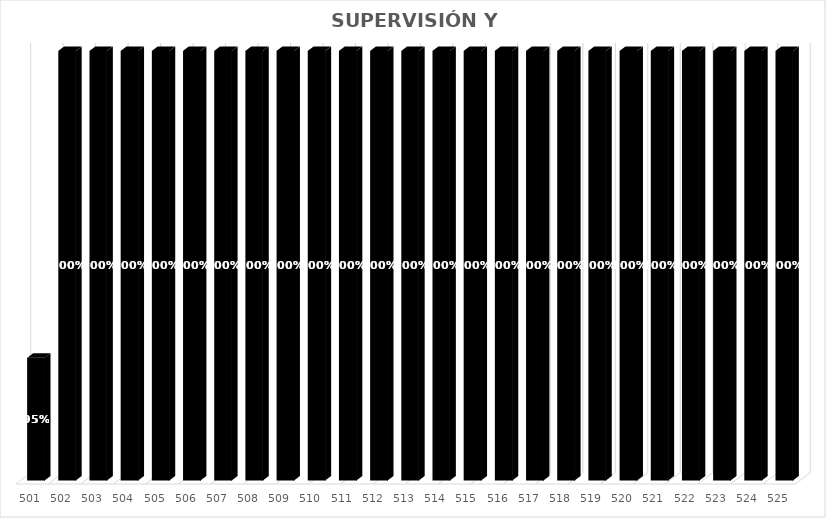
| Category | % Avance |
|---|---|
| 501.0 | 0.95 |
| 502.0 | 1 |
| 503.0 | 1 |
| 504.0 | 1 |
| 505.0 | 1 |
| 506.0 | 1 |
| 507.0 | 1 |
| 508.0 | 1 |
| 509.0 | 1 |
| 510.0 | 1 |
| 511.0 | 1 |
| 512.0 | 1 |
| 513.0 | 1 |
| 514.0 | 1 |
| 515.0 | 1 |
| 516.0 | 1 |
| 517.0 | 1 |
| 518.0 | 1 |
| 519.0 | 1 |
| 520.0 | 1 |
| 521.0 | 1 |
| 522.0 | 1 |
| 523.0 | 1 |
| 524.0 | 1 |
| 525.0 | 1 |